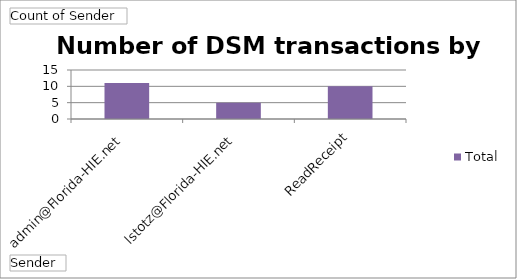
| Category | Total |
|---|---|
| admin@Florida-HIE.net | 11 |
| lstotz@Florida-HIE.net | 5 |
| ReadReceipt | 10 |